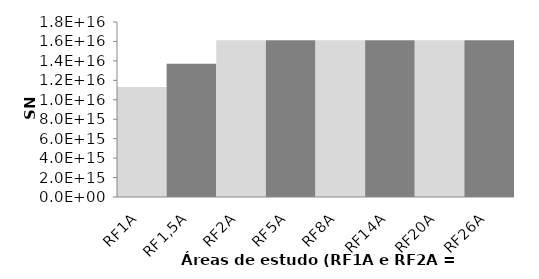
| Category | Series 0 |
|---|---|
| RF1A | 11317836446629212 |
| RF1,5A | 13715016104868912 |
| RF2A | 16112195763108612 |
| RF5A | 16112195763108612 |
| RF8A | 16112195763108612 |
| RF14A | 16112195763108612 |
| RF20A | 16112195763108612 |
| RF26A | 16112195763108612 |